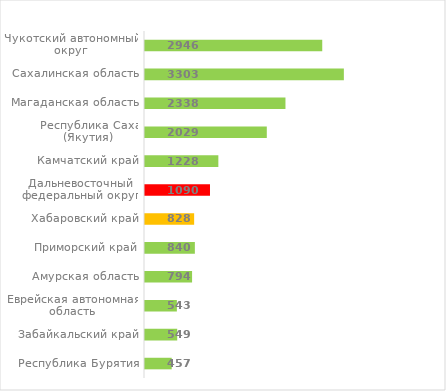
| Category | Итог |
|---|---|
| Республика Бурятия | 457864.5 |
| Забайкальский край | 549172 |
| Еврейская автономная область | 543204.8 |
| Амурская область | 794644.1 |
| Приморский край | 840706.9 |
| Хабаровский край | 828825.8 |
| Дальневосточный федеральный округ | 1090778.1 |
| Камчатский край | 1228904.5 |
| Республика Саха (Якутия) | 2029719.8 |
| Магаданская область | 2338219.1 |
| Сахалинская область | 3303417 |
| Чукотский автономный округ | 2946171.5 |